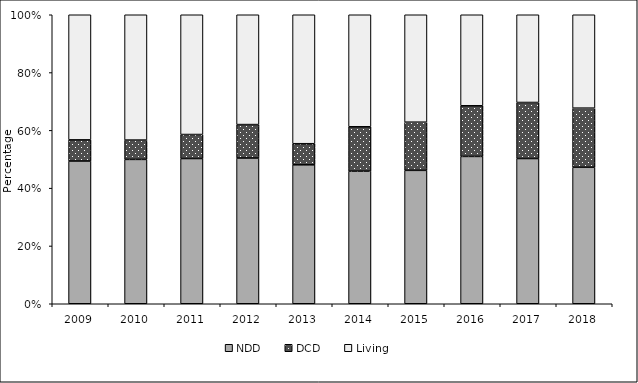
| Category | NDD | DCD | Living |
|---|---|---|---|
| 2009.0 | 478 | 71 | 419 |
| 2010.0 | 508 | 68 | 441 |
| 2011.0 | 496 | 82 | 409 |
| 2012.0 | 540 | 124 | 407 |
| 2013.0 | 501 | 76 | 465 |
| 2014.0 | 496 | 166 | 419 |
| 2015.0 | 529 | 191 | 426 |
| 2016.0 | 675 | 232 | 417 |
| 2017.0 | 697 | 269 | 421 |
| 2018.0 | 646 | 280 | 442 |